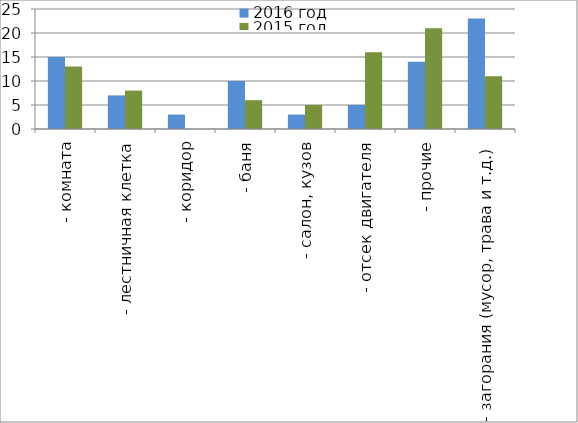
| Category | 2016 год | 2015 год |
|---|---|---|
|  - комната | 15 | 13 |
|  - лестничная клетка | 7 | 8 |
|  - коридор | 3 | 0 |
|  - баня | 10 | 6 |
|  - салон, кузов | 3 | 5 |
|  - отсек двигателя | 5 | 16 |
| - прочие | 14 | 21 |
| - загорания (мусор, трава и т.д.)  | 23 | 11 |